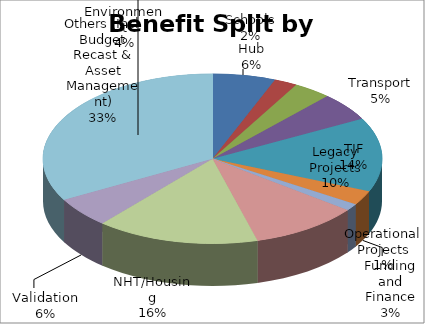
| Category | Series 0 |
|---|---|
| Hub | 6800000 |
| Schools | 2500000 |
| Environment | 4100000 |
| Transport | 6100000 |
| TIF | 16000000 |
| Funding and Finance | 3100000 |
| Operational Projects | 1500000 |
| Legacy Projects | 11800000 |
| NHT/Housing | 17600000 |
| Validation | 6500000 |
| Others (Incl Budget Recast & Asset Management) | 37500000 |